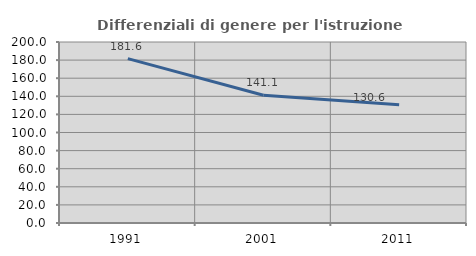
| Category | Differenziali di genere per l'istruzione superiore |
|---|---|
| 1991.0 | 181.574 |
| 2001.0 | 141.087 |
| 2011.0 | 130.604 |